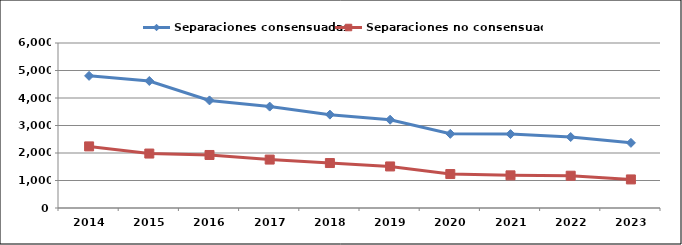
| Category | Separaciones consensuadas | Separaciones no consensuadas |
|---|---|---|
| 2014.0 | 4805 | 2240 |
| 2015.0 | 4619 | 1980 |
| 2016.0 | 3912 | 1928 |
| 2017.0 | 3687 | 1761 |
| 2018.0 | 3395 | 1635 |
| 2019.0 | 3210 | 1511 |
| 2020.0 | 2697 | 1235 |
| 2021.0 | 2687 | 1187 |
| 2022.0 | 2581 | 1174 |
| 2023.0 | 2369 | 1039 |